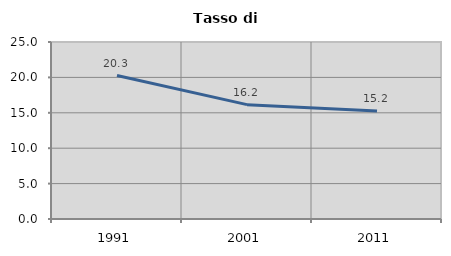
| Category | Tasso di disoccupazione   |
|---|---|
| 1991.0 | 20.264 |
| 2001.0 | 16.152 |
| 2011.0 | 15.238 |